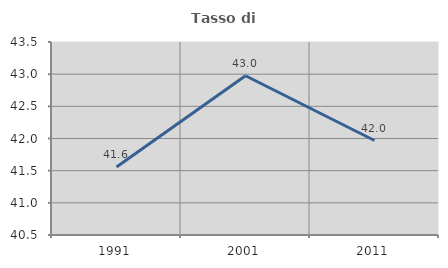
| Category | Tasso di occupazione   |
|---|---|
| 1991.0 | 41.557 |
| 2001.0 | 42.976 |
| 2011.0 | 41.969 |